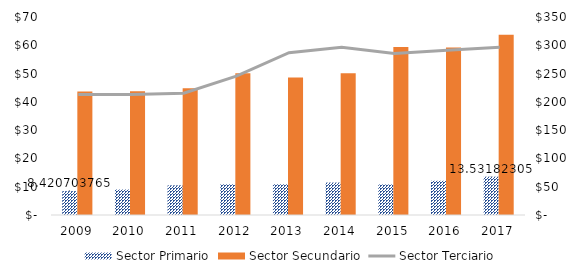
| Category | Sector Primario | Sector Secundario |
|---|---|---|
| 2009 | 8.421 | 43.697 |
| 2010 | 9.01 | 43.77 |
| 2011 | 10.465 | 44.827 |
| 2012 | 10.845 | 50.126 |
| 2013 | 10.855 | 48.571 |
| 2014 | 11.442 | 50.118 |
| 2015 | 10.798 | 59.413 |
| 2016 | 12.111 | 59.247 |
| 2017 | 13.532 | 63.702 |